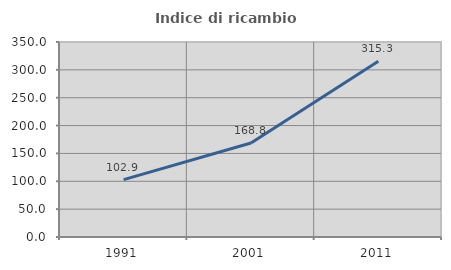
| Category | Indice di ricambio occupazionale  |
|---|---|
| 1991.0 | 102.938 |
| 2001.0 | 168.761 |
| 2011.0 | 315.289 |